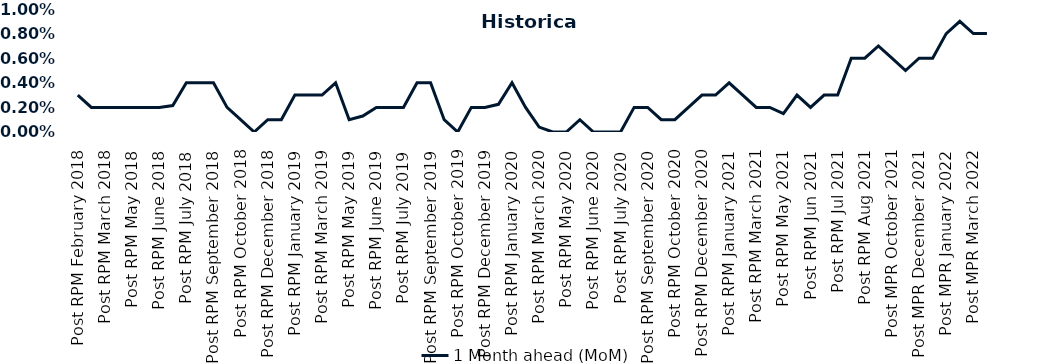
| Category | 1 Month ahead (MoM) |
|---|---|
| Post RPM February 2018 | 0.003 |
| Pre RPM March 2018 | 0.002 |
| Post RPM March 2018 | 0.002 |
| Pre RPM May 2018 | 0.002 |
| Post RPM May 2018 | 0.002 |
| Pre RPM June 2018 | 0.002 |
| Post RPM June 2018 | 0.002 |
| Pre RPM July 2018 | 0.002 |
| Post RPM July 2018 | 0.004 |
| Pre RPM September 2018 | 0.004 |
| Post RPM September 2018 | 0.004 |
| Pre RPM October 2018 | 0.002 |
| Post RPM October 2018 | 0.001 |
| Pre RPM December 2018 | 0 |
| Post RPM December 2018 | 0.001 |
| Pre RPM January 2019 | 0.001 |
| Post RPM January 2019 | 0.003 |
| Pre RPM March 2019 | 0.003 |
| Post RPM March 2019 | 0.003 |
| Pre RPM May 2019 | 0.004 |
| Post RPM May 2019 | 0.001 |
| Pre RPM June 2019 | 0.001 |
| Post RPM June 2019 | 0.002 |
| Pre RPM July 2019 | 0.002 |
| Post RPM July 2019 | 0.002 |
| Pre RPM September 2019 | 0.004 |
| Post RPM September 2019 | 0.004 |
| Pre RPM October 2019 | 0.001 |
| Post RPM October 2019 | 0 |
| Pre RPM December 2019 | 0.002 |
| Post RPM December 2019 | 0.002 |
| Pre RPM January 2020 | 0.002 |
| Post RPM January 2020 | 0.004 |
| Pre RPM March 2020 | 0.002 |
| Post RPM March 2020 | 0 |
| Pre RPM May 2020 | 0 |
| Post RPM May 2020 | 0 |
| Pre RPM June 2020 | 0.001 |
| Post RPM June 2020 | 0 |
| Pre RPM July 2020 | 0 |
| Post RPM July 2020 | 0 |
| Pre RPM September 2020 | 0.002 |
| Post RPM September 2020 | 0.002 |
| Pre RPM October 2020 | 0.001 |
| Post RPM October 2020 | 0.001 |
| Pre RPM December 2020 | 0.002 |
|  Post RPM December 2020 | 0.003 |
| Pre RPM January 2021 | 0.003 |
| Post RPM January 2021 | 0.004 |
|  Pre RPM March 2021 | 0.003 |
|  Post RPM March 2021 | 0.002 |
|  Pre RPM May 2021 | 0.002 |
|  Post RPM May 2021 | 0.002 |
|  Pre RPM Jun 2021 | 0.003 |
|   Post RPM Jun 2021 | 0.002 |
| Pre RPM Jul 2021 | 0.003 |
|  Post RPM Jul 2021 | 0.003 |
| Pre RPM Aug 2021 | 0.006 |
|  Post RPM Aug 2021 | 0.006 |
| Pre MPR October 2021 | 0.007 |
| Post MPR October 2021 | 0.006 |
| Pre MPR December 2021 | 0.005 |
| Post MPR December 2021 | 0.006 |
| Pre MPR January 2022 | 0.006 |
| Post MPR January 2022 | 0.008 |
| Pre MPR March 2022 | 0.009 |
| Post MPR March 2022 | 0.008 |
| Pre MPR May 2022 | 0.008 |